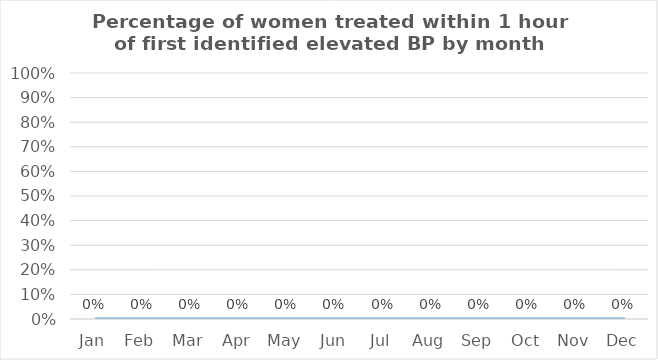
| Category | Percentage of women treated within 1 hour of first identified elevated BP |
|---|---|
| Jan | 0 |
| Feb | 0 |
| Mar | 0 |
| Apr | 0 |
| May | 0 |
| Jun | 0 |
| Jul | 0 |
| Aug | 0 |
| Sep | 0 |
| Oct | 0 |
| Nov | 0 |
| Dec | 0 |